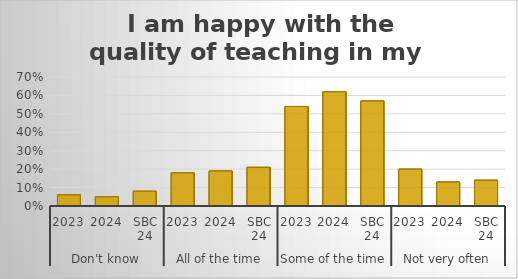
| Category |  I am happy with the quality of teaching in my school. |
|---|---|
| 0 | 0.06 |
| 1 | 0.05 |
| 2 | 0.08 |
| 3 | 0.18 |
| 4 | 0.19 |
| 5 | 0.21 |
| 6 | 0.54 |
| 7 | 0.62 |
| 8 | 0.57 |
| 9 | 0.2 |
| 10 | 0.13 |
| 11 | 0.14 |